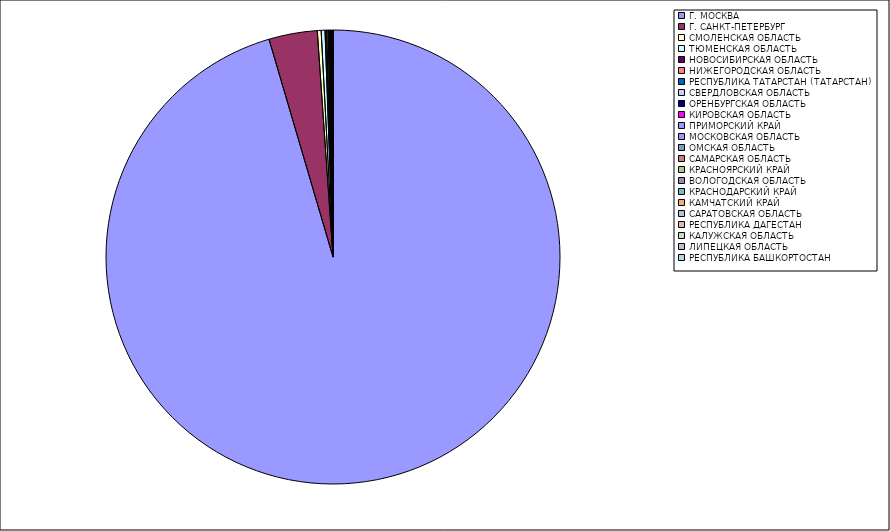
| Category | Оборот |
|---|---|
| Г. МОСКВА | 95.393 |
| Г. САНКТ-ПЕТЕРБУРГ | 3.443 |
| СМОЛЕНСКАЯ ОБЛАСТЬ | 0.273 |
| ТЮМЕНСКАЯ ОБЛАСТЬ | 0.271 |
| НОВОСИБИРСКАЯ ОБЛАСТЬ | 0.116 |
| НИЖЕГОРОДСКАЯ ОБЛАСТЬ | 0.101 |
| РЕСПУБЛИКА ТАТАРСТАН (ТАТАРСТАН) | 0.082 |
| СВЕРДЛОВСКАЯ ОБЛАСТЬ | 0.052 |
| ОРЕНБУРГСКАЯ ОБЛАСТЬ | 0.033 |
| КИРОВСКАЯ ОБЛАСТЬ | 0.027 |
| ПРИМОРСКИЙ КРАЙ | 0.026 |
| МОСКОВСКАЯ ОБЛАСТЬ | 0.021 |
| ОМСКАЯ ОБЛАСТЬ | 0.017 |
| САМАРСКАЯ ОБЛАСТЬ | 0.012 |
| КРАСНОЯРСКИЙ КРАЙ | 0.012 |
| ВОЛОГОДСКАЯ ОБЛАСТЬ | 0.011 |
| КРАСНОДАРСКИЙ КРАЙ | 0.01 |
| КАМЧАТСКИЙ КРАЙ | 0.009 |
| САРАТОВСКАЯ ОБЛАСТЬ | 0.007 |
| РЕСПУБЛИКА ДАГЕСТАН | 0.007 |
| КАЛУЖСКАЯ ОБЛАСТЬ | 0.006 |
| ЛИПЕЦКАЯ ОБЛАСТЬ | 0.006 |
| РЕСПУБЛИКА БАШКОРТОСТАН | 0.005 |